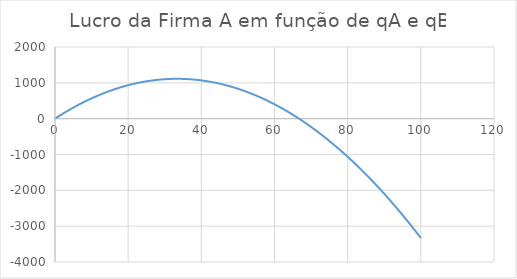
| Category | Series 0 |
|---|---|
| 0.0 | 0 |
| 1.0 | 65.7 |
| 2.0 | 129.4 |
| 3.0 | 191.1 |
| 4.0 | 250.8 |
| 5.0 | 308.5 |
| 6.0 | 364.2 |
| 7.0 | 417.9 |
| 8.0 | 469.6 |
| 9.0 | 519.3 |
| 10.0 | 567 |
| 11.0 | 612.7 |
| 12.0 | 656.4 |
| 13.0 | 698.1 |
| 14.0 | 737.8 |
| 15.0 | 775.5 |
| 16.0 | 811.2 |
| 17.0 | 844.9 |
| 18.0 | 876.6 |
| 19.0 | 906.3 |
| 20.0 | 934 |
| 21.0 | 959.7 |
| 22.0 | 983.4 |
| 23.0 | 1005.1 |
| 24.0 | 1024.8 |
| 25.0 | 1042.5 |
| 26.0 | 1058.2 |
| 27.0 | 1071.9 |
| 28.0 | 1083.6 |
| 29.0 | 1093.3 |
| 30.0 | 1101 |
| 31.0 | 1106.7 |
| 32.0 | 1110.4 |
| 33.0 | 1112.1 |
| 34.0 | 1111.8 |
| 35.0 | 1109.5 |
| 36.0 | 1105.2 |
| 37.0 | 1098.9 |
| 38.0 | 1090.6 |
| 39.0 | 1080.3 |
| 40.0 | 1068 |
| 41.0 | 1053.7 |
| 42.0 | 1037.4 |
| 43.0 | 1019.1 |
| 44.0 | 998.8 |
| 45.0 | 976.5 |
| 46.0 | 952.2 |
| 47.0 | 925.9 |
| 48.0 | 897.6 |
| 49.0 | 867.3 |
| 50.0 | 835 |
| 51.0 | 800.7 |
| 52.0 | 764.4 |
| 53.0 | 726.1 |
| 54.0 | 685.8 |
| 55.0 | 643.5 |
| 56.0 | 599.2 |
| 57.0 | 552.9 |
| 58.0 | 504.6 |
| 59.0 | 454.3 |
| 60.0 | 402 |
| 61.0 | 347.7 |
| 62.0 | 291.4 |
| 63.0 | 233.1 |
| 64.0 | 172.8 |
| 65.0 | 110.5 |
| 66.0 | 46.2 |
| 67.0 | -20.1 |
| 68.0 | -88.4 |
| 69.0 | -158.7 |
| 70.0 | -231 |
| 71.0 | -305.3 |
| 72.0 | -381.6 |
| 73.0 | -459.9 |
| 74.0 | -540.2 |
| 75.0 | -622.5 |
| 76.0 | -706.8 |
| 77.0 | -793.1 |
| 78.0 | -881.4 |
| 79.0 | -971.7 |
| 80.0 | -1064 |
| 81.0 | -1158.3 |
| 82.0 | -1254.6 |
| 83.0 | -1352.9 |
| 84.0 | -1453.2 |
| 85.0 | -1555.5 |
| 86.0 | -1659.8 |
| 87.0 | -1766.1 |
| 88.0 | -1874.4 |
| 89.0 | -1984.7 |
| 90.0 | -2097 |
| 91.0 | -2211.3 |
| 92.0 | -2327.6 |
| 93.0 | -2445.9 |
| 94.0 | -2566.2 |
| 95.0 | -2688.5 |
| 96.0 | -2812.8 |
| 97.0 | -2939.1 |
| 98.0 | -3067.4 |
| 99.0 | -3197.7 |
| 100.0 | -3330 |